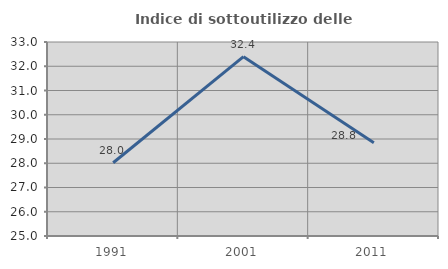
| Category | Indice di sottoutilizzo delle abitazioni  |
|---|---|
| 1991.0 | 28.022 |
| 2001.0 | 32.394 |
| 2011.0 | 28.846 |